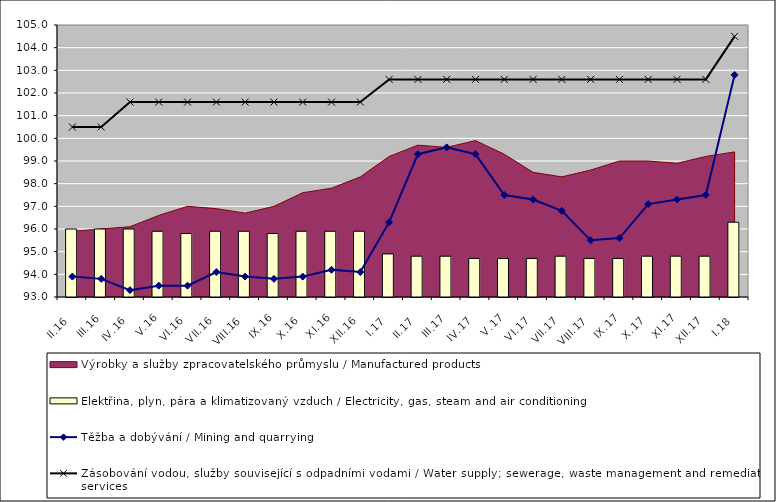
| Category | Elektřina, plyn, pára a klimatizovaný vzduch / Electricity, gas, steam and air conditioning |
|---|---|
| II.16 | 96 |
| III.16 | 96 |
| IV.16 | 96 |
| V.16 | 95.9 |
| VI.16 | 95.8 |
| VII.16 | 95.9 |
| VIII.16 | 95.9 |
| IX.16 | 95.8 |
| X.16 | 95.9 |
| XI.16 | 95.9 |
| XII.16 | 95.9 |
| I.17 | 94.9 |
| II.17 | 94.8 |
| III.17 | 94.8 |
| IV.17 | 94.7 |
| V.17 | 94.7 |
| VI.17 | 94.7 |
| VII.17 | 94.8 |
| VIII.17 | 94.7 |
| IX.17 | 94.7 |
| X.17 | 94.8 |
| XI.17 | 94.8 |
| XII.17 | 94.8 |
| I.18 | 96.3 |